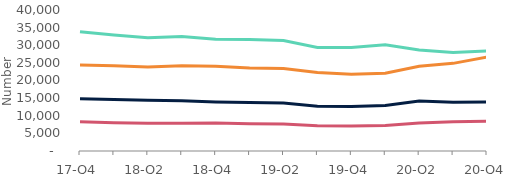
| Category | Arrears of 2.5%-5% of balance | Arrears of 5%-7.5% of balance | Arrears of 7.5%-10% of balance | Arrears over 10% of balance |
|---|---|---|---|---|
| 17-Q4 | 33810 | 14810 | 8290 | 24380 |
| 18-Q1 | 32900 | 14590 | 8000 | 24180 |
| 18-Q2 | 32140 | 14380 | 7870 | 23850 |
| 18-Q3 | 32500 | 14260 | 7880 | 24180 |
| 18-Q4 | 31730 | 13900 | 7970 | 24020 |
| 19-Q1 | 31610 | 13730 | 7760 | 23540 |
| 19-Q2 | 31320 | 13620 | 7630 | 23390 |
| 19-Q3 | 29380 | 12730 | 7180 | 22300 |
| 19-Q4 | 29380 | 12640 | 7080 | 21770 |
| 20-Q1 | 30170 | 12920 | 7220 | 22040 |
| 20-Q2 | 28670 | 14180 | 7920 | 24060 |
| 20-Q3 | 27910 | 13800 | 8280 | 24860 |
| 20-Q4 | 28400 | 13870 | 8480 | 26660 |